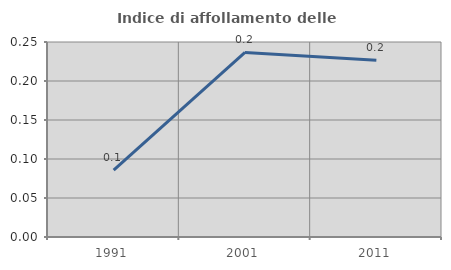
| Category | Indice di affollamento delle abitazioni  |
|---|---|
| 1991.0 | 0.086 |
| 2001.0 | 0.237 |
| 2011.0 | 0.227 |